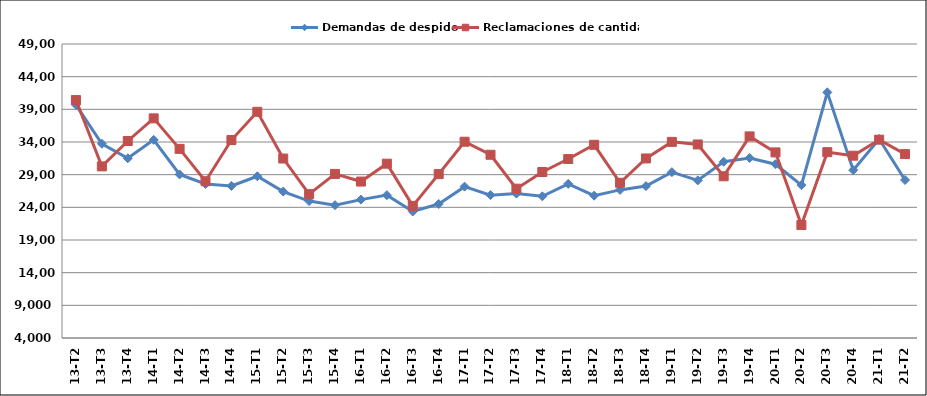
| Category | Demandas de despido | Reclamaciones de cantidad |
|---|---|---|
| 13-T2 | 39682 | 40424 |
| 13-T3 | 33730 | 30268 |
| 13-T4 | 31506 | 34154 |
| 14-T1 | 34327 | 37617 |
| 14-T2 | 29037 | 32948 |
| 14-T3 | 27571 | 27999 |
| 14-T4 | 27278 | 34299 |
| 15-T1 | 28755 | 38621 |
| 15-T2 | 26417 | 31470 |
| 15-T3 | 24957 | 26018 |
| 15-T4 | 24328 | 29112 |
| 16-T1 | 25182 | 27945 |
| 16-T2 | 25866 | 30682 |
| 16-T3 | 23364 | 24220 |
| 16-T4 | 24509 | 29081 |
| 17-T1 | 27166 | 34041 |
| 17-T2 | 25869 | 32047 |
| 17-T3 | 26101 | 26854 |
| 17-T4 | 25688 | 29408 |
| 18-T1 | 27589 | 31392 |
| 18-T2 | 25785 | 33573 |
| 18-T3 | 26669 | 27761 |
| 18-T4 | 27251 | 31480 |
| 19-T1 | 29386 | 34020 |
| 19-T2 | 28121 | 33623 |
| 19-T3 | 30981 | 28752 |
| 19-T4 | 31561 | 34857 |
| 20-T1 | 30597 | 32408 |
| 20-T2 | 27401 | 21297 |
| 20-T3 | 41597 | 32446 |
| 20-T4 | 29692 | 31906 |
| 21-T1 | 34461 | 34356 |
| 21-T2 | 28179 | 32151 |